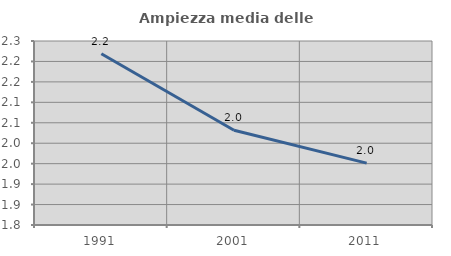
| Category | Ampiezza media delle famiglie |
|---|---|
| 1991.0 | 2.219 |
| 2001.0 | 2.032 |
| 2011.0 | 1.951 |